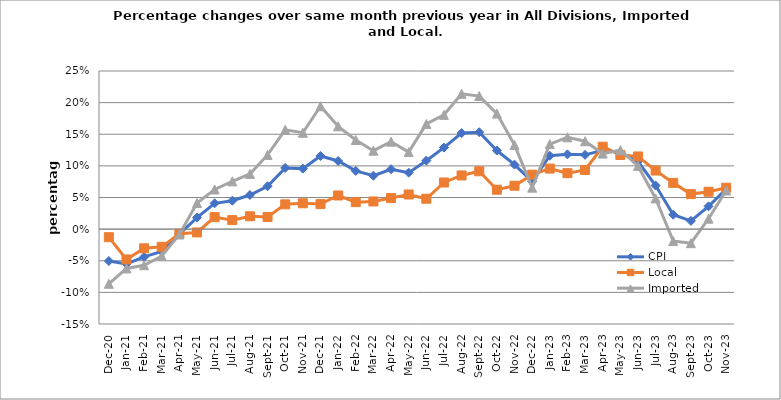
| Category | CPI | Local | Imported |
|---|---|---|---|
| 2020-12-01 | -0.05 | -0.013 | -0.086 |
| 2021-01-01 | -0.055 | -0.048 | -0.062 |
| 2021-02-01 | -0.044 | -0.03 | -0.057 |
| 2021-03-01 | -0.035 | -0.028 | -0.043 |
| 2021-04-01 | -0.008 | -0.007 | -0.008 |
| 2021-05-01 | 0.018 | -0.005 | 0.041 |
| 2021-06-01 | 0.041 | 0.019 | 0.063 |
| 2021-07-01 | 0.045 | 0.014 | 0.075 |
| 2021-08-01 | 0.054 | 0.02 | 0.087 |
| 2021-09-01 | 0.068 | 0.019 | 0.117 |
| 2021-10-01 | 0.097 | 0.039 | 0.157 |
| 2021-11-01 | 0.096 | 0.041 | 0.152 |
| 2021-12-01 | 0.116 | 0.04 | 0.194 |
| 2022-01-01 | 0.108 | 0.053 | 0.163 |
| 2022-02-01 | 0.092 | 0.043 | 0.141 |
| 2022-03-01 | 0.085 | 0.044 | 0.124 |
| 2022-04-01 | 0.095 | 0.049 | 0.138 |
| 2022-05-01 | 0.089 | 0.055 | 0.122 |
| 2022-06-01 | 0.108 | 0.048 | 0.166 |
| 2022-07-01 | 0.129 | 0.074 | 0.181 |
| 2022-08-01 | 0.152 | 0.085 | 0.214 |
| 2022-09-01 | 0.153 | 0.091 | 0.21 |
| 2022-10-01 | 0.124 | 0.062 | 0.183 |
| 2022-11-01 | 0.102 | 0.069 | 0.133 |
| 2022-12-01 | 0.075 | 0.086 | 0.066 |
| 2023-01-01 | 0.116 | 0.096 | 0.134 |
| 2023-02-01 | 0.118 | 0.088 | 0.145 |
| 2023-03-01 | 0.117 | 0.094 | 0.139 |
| 2023-04-01 | 0.124 | 0.13 | 0.119 |
| 2023-05-01 | 0.121 | 0.117 | 0.125 |
| 2023-06-01 | 0.107 | 0.115 | 0.1 |
| 2023-07-01 | 0.069 | 0.093 | 0.049 |
| 2023-08-01 | 0.023 | 0.073 | -0.019 |
| 2023-09-01 | 0.013 | 0.055 | -0.022 |
| 2023-10-01 | 0.036 | 0.059 | 0.016 |
| 2023-11-01 | 0.063 | 0.065 | 0.061 |